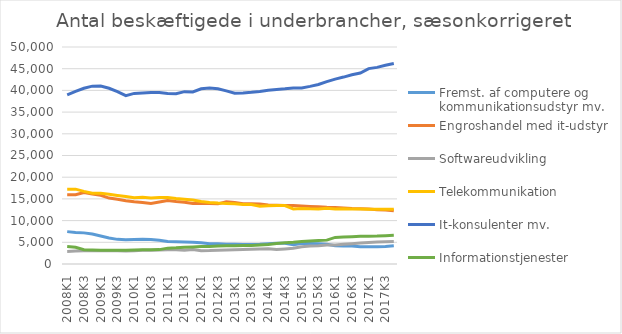
| Category | Fremst. af computere og kommunikationsudstyr mv. | Engroshandel med it-udstyr | Softwareudvikling | Telekommunikation | It-konsulenter mv. | Informationstjenester |
|---|---|---|---|---|---|---|
| 2008K1 | 7458.491 | 15955.153 | 2901.651 | 17236.16 | 38983.278 | 4021.246 |
| 2008K2 | 7273.738 | 15964.836 | 2971.428 | 17246.553 | 39777.881 | 3853.361 |
| 2008K3 | 7172.27 | 16476.396 | 3054.453 | 16725.514 | 40501.442 | 3297.877 |
| 2008K4 | 6894.294 | 16129.917 | 3104.304 | 16317.504 | 40977.364 | 3240.826 |
| 2009K1 | 6437.685 | 15823.769 | 3059.479 | 16303.603 | 40998.514 | 3181.234 |
| 2009K2 | 5980.759 | 15182.704 | 3024.618 | 16070.836 | 40484.349 | 3153.509 |
| 2009K3 | 5675.817 | 14914.396 | 3030.223 | 15801.539 | 39723.774 | 3142.191 |
| 2009K4 | 5591.007 | 14588.556 | 3015.95 | 15528.432 | 38791.233 | 3157.194 |
| 2010K1 | 5661.913 | 14359.211 | 3080.221 | 15245.723 | 39306.155 | 3200.376 |
| 2010K2 | 5730.143 | 14183.055 | 3155.619 | 15388.8 | 39402.085 | 3269.517 |
| 2010K3 | 5624.079 | 13968.053 | 3183.951 | 15185.809 | 39515.969 | 3296.47 |
| 2010K4 | 5447.625 | 14279.489 | 3240.382 | 15317.128 | 39490.034 | 3314.724 |
| 2011K1 | 5184.118 | 14605.861 | 3298.154 | 15319.524 | 39276.94 | 3654.012 |
| 2011K2 | 5130.796 | 14383.084 | 3262.342 | 15081.388 | 39212.015 | 3725.664 |
| 2011K3 | 5067.9 | 14233.578 | 3153.941 | 14914.159 | 39712.774 | 3857.945 |
| 2011K4 | 5039.341 | 13958.304 | 3345.539 | 14766.34 | 39655.564 | 3922.803 |
| 2012K1 | 4918.917 | 14020.329 | 3050.854 | 14423.159 | 40376.44 | 4027.159 |
| 2012K2 | 4686.594 | 13935.46 | 3089.813 | 14171.957 | 40569.583 | 4037.091 |
| 2012K3 | 4681.738 | 13859.159 | 3180.748 | 14033.683 | 40368.248 | 4141.687 |
| 2012K4 | 4535.623 | 14316.607 | 3231.575 | 13957.153 | 39897.43 | 4226.841 |
| 2013K1 | 4525.004 | 14180.329 | 3281.443 | 13900.76 | 39342.779 | 4215.378 |
| 2013K2 | 4498.952 | 13880.874 | 3332.576 | 13684.879 | 39399.089 | 4253.958 |
| 2013K3 | 4493.749 | 13895.282 | 3397.677 | 13692.498 | 39550.071 | 4257.823 |
| 2013K4 | 4528.859 | 13845.285 | 3456.402 | 13320.733 | 39761.063 | 4365.226 |
| 2014K1 | 4683.385 | 13606.387 | 3539.386 | 13404.439 | 40030.305 | 4508.13 |
| 2014K2 | 4794.738 | 13560.943 | 3363.646 | 13469.938 | 40195.037 | 4729.321 |
| 2014K3 | 4792.971 | 13479.738 | 3479.498 | 13463.728 | 40354.404 | 4896.345 |
| 2014K4 | 4440.389 | 13485.637 | 3616.389 | 12677.629 | 40564.821 | 5018.399 |
| 2015K1 | 4704.874 | 13369.435 | 3990.334 | 12805.076 | 40567.957 | 5183.473 |
| 2015K2 | 4701.933 | 13273.885 | 4120.882 | 12713.43 | 40927.974 | 5294.984 |
| 2015K3 | 4639.215 | 13174.085 | 4211.095 | 12678.698 | 41365.22 | 5393.533 |
| 2015K4 | 4528.883 | 13049.246 | 4379.45 | 12860.105 | 42007.431 | 5499.843 |
| 2016K1 | 4225.66 | 12993.018 | 4358.023 | 12674.145 | 42606.549 | 6133.298 |
| 2016K2 | 4127.699 | 12916.192 | 4542.06 | 12717.337 | 43070.453 | 6209.225 |
| 2016K3 | 4124.02 | 12783.742 | 4691.94 | 12665.447 | 43600.754 | 6284.235 |
| 2016K4 | 3975.789 | 12716.289 | 4837.246 | 12650.196 | 43991.039 | 6379.876 |
| 2017K1 | 3973.573 | 12656.206 | 4963.083 | 12633.729 | 45017.443 | 6397.343 |
| 2017K2 | 3950.602 | 12515.012 | 5055.736 | 12587.757 | 45308.85 | 6428.145 |
| 2017K3 | 4017.907 | 12455.893 | 5122.387 | 12628.857 | 45798.278 | 6513.896 |
| 2017K4 | 4211.599 | 12271.115 | 5178.733 | 12599.567 | 46211.989 | 6605.557 |